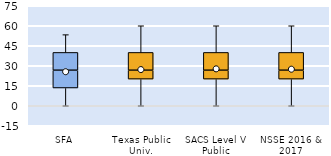
| Category | 25th | 50th | 75th |
|---|---|---|---|
| SFA | 13.333 | 13.333 | 13.333 |
| Texas Public Univ. | 20 | 6.667 | 13.333 |
| SACS Level V Public | 20 | 6.667 | 13.333 |
| NSSE 2016 & 2017 | 20 | 6.667 | 13.333 |